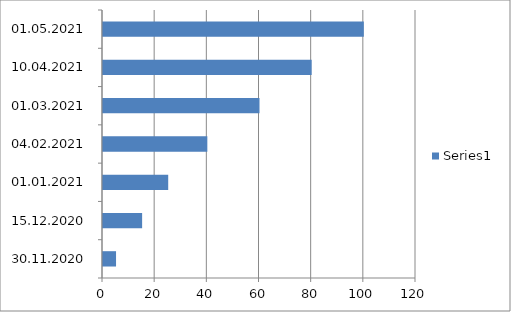
| Category | Series 0 |
|---|---|
| 30.11.2020 | 5 |
| 15.12.2020 | 15 |
| 01.01.2021 | 25 |
| 04.02.2021 | 40 |
| 01.03.2021 | 60 |
| 10.04.2021 | 80 |
| 01.05.2021 | 100 |